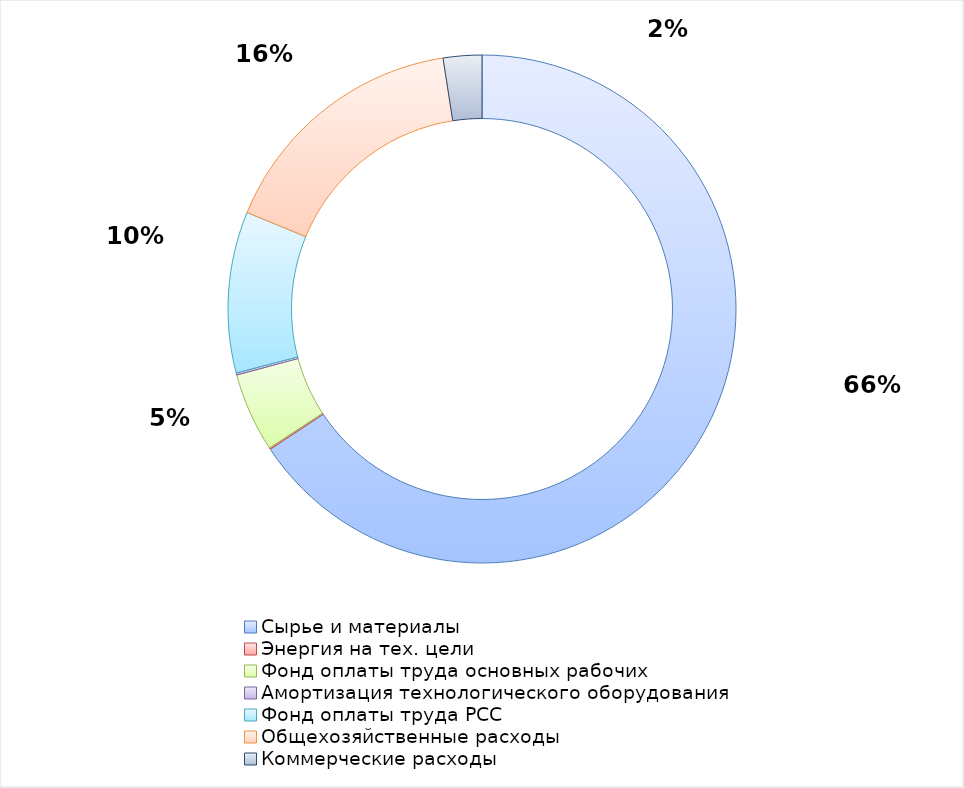
| Category | Series 0 |
|---|---|
| Сырье и материалы | 52500000 |
| Энергия на тех. цели | 73233.6 |
| Фонд оплаты труда основных рабочих | 4023023.76 |
| Амортизация технологического оборудования | 109250 |
| Фонд оплаты труда РСС | 8193624.012 |
| Общехозяйственные расходы  | 13064169.142 |
| Коммерческие расходы  | 1959625.371 |